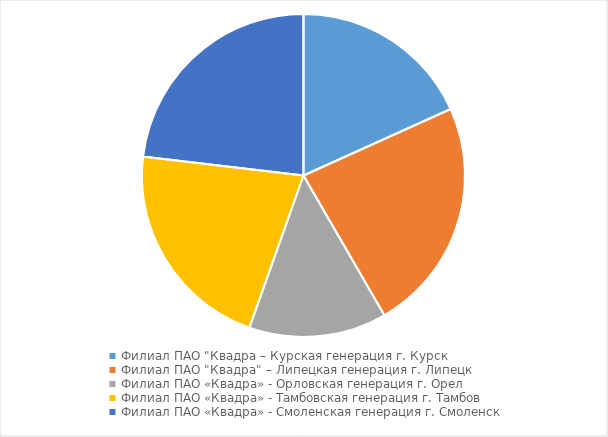
| Category | ИП |
|---|---|
| Филиал ПАО "Квадра – Курская генерация г. Курск | 0.756 |
| Филиал ПАО "Квадра" – Липецкая генерация г. Липецк | 0.97 |
| Филиал ПАО «Квадра» - Орловская генерация г. Орел | 0.571 |
| Филиал ПАО «Квадра» - Тамбовская генерация г. Тамбов | 0.888 |
| Филиал ПАО «Квадра» - Смоленская генерация г. Смоленск | 0.958 |